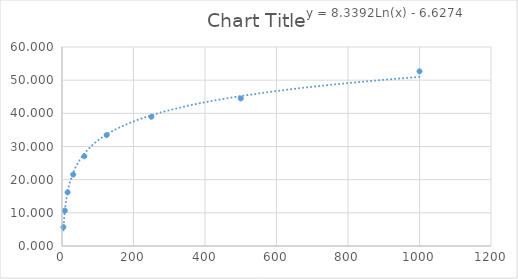
| Category | Series 0 |
|---|---|
| 3.91 | 5.694 |
| 7.81 | 10.676 |
| 15.62 | 16.192 |
| 31.25 | 21.53 |
| 62.5 | 27.046 |
| 125.0 | 33.452 |
| 250.0 | 38.968 |
| 500.0 | 44.484 |
| 1000.0 | 52.669 |